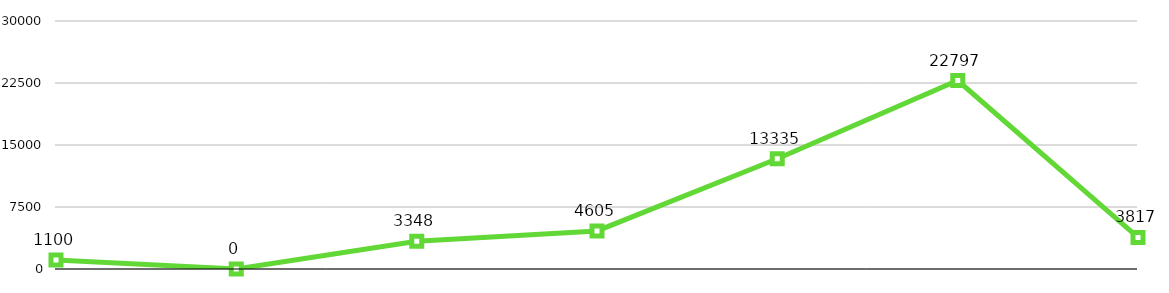
| Category | Totals |
|---|---|
|  | 1100 |
|  | 0 |
|  | 3348 |
|  | 4605 |
|  | 13335 |
|  | 22797 |
|  | 3817 |